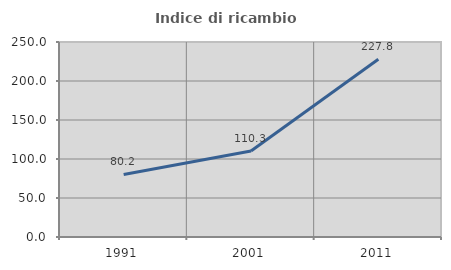
| Category | Indice di ricambio occupazionale  |
|---|---|
| 1991.0 | 80.234 |
| 2001.0 | 110.315 |
| 2011.0 | 227.801 |